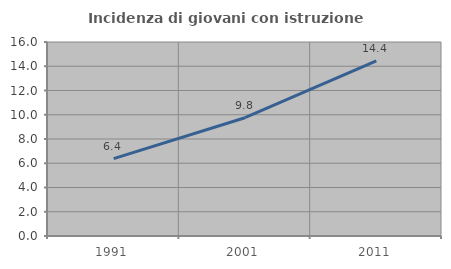
| Category | Incidenza di giovani con istruzione universitaria |
|---|---|
| 1991.0 | 6.379 |
| 2001.0 | 9.755 |
| 2011.0 | 14.439 |